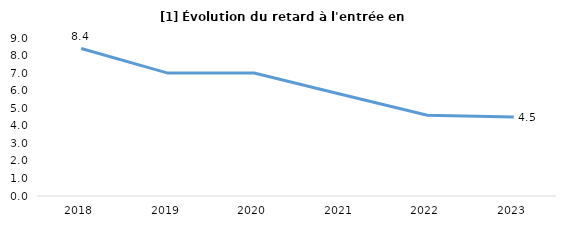
| Category | Total en retard |
|---|---|
| 2018 | 8.4 |
| 2019 | 7 |
| 2020 | 7 |
| 2021 | 5.8 |
| 2022 | 4.6 |
| 2023 | 4.5 |